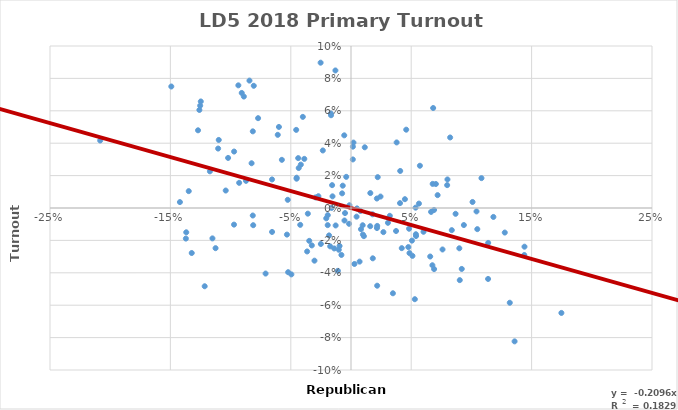
| Category | Series 0 |
|---|---|
| -0.12970652173913044 | 0.101 |
| -0.12705 | 0.048 |
| -0.08158478260869566 | -0.005 |
| 0.0015097560975609729 | 0.03 |
| -0.14924827586206896 | 0.075 |
| -0.059871739130434774 | 0.05 |
| -0.08256739130434783 | 0.028 |
| -0.09356086956521743 | 0.076 |
| -0.12114130434782612 | 0.101 |
| -0.20831428571428576 | 0.042 |
| -0.0928782608695652 | 0.016 |
| -0.08155000000000001 | 0.047 |
| -0.11718043478260871 | 0.023 |
| -0.0843260869565217 | 0.079 |
| -0.06082391304347827 | 0.045 |
| -0.1347695652173913 | 0.01 |
| -0.1421 | 0.004 |
| -0.12593478260869562 | 0.061 |
| -0.0709326086956522 | -0.04 |
| -0.10404782608695652 | 0.011 |
| -0.016760869565217388 | 0.058 |
| -0.1252717391304348 | 0.063 |
| -0.12475434782608695 | 0.066 |
| -0.030333333333333334 | -0.033 |
| 0.004986956521739129 | 0 |
| -0.0871978260869565 | 0.017 |
| -0.11508478260869567 | -0.019 |
| -0.1322826086956522 | -0.028 |
| -0.11035 | 0.037 |
| -0.029365517241379317 | 0.007 |
| -0.016131707317073172 | 0 |
| -0.045165217391304344 | 0.018 |
| 0.007830434782608696 | -0.002 |
| -0.09709130434782606 | 0.035 |
| -0.013939130434782608 | -0.025 |
| -0.018219565217391313 | -0.017 |
| -0.06556410256410256 | -0.015 |
| -0.1371521739130435 | -0.019 |
| -0.006854545454545457 | 0.014 |
| -0.11248965517241381 | -0.025 |
| -0.10984565217391308 | 0.042 |
| 0.04071521739130435 | 0.003 |
| -0.04551739130434782 | 0.048 |
| -0.1368423076923077 | -0.015 |
| -0.08075217391304347 | 0.075 |
| -0.058781818181818185 | -0.123 |
| -0.009490243902439025 | -0.023 |
| -0.015686956521739126 | 0.014 |
| -0.01728043478260869 | -0.024 |
| -0.0971641025641026 | -0.01 |
| -0.035843589743589734 | -0.004 |
| -0.041677272727272736 | 0.027 |
| -0.08122820512820514 | -0.011 |
| 0.04478260869565218 | 0.005 |
| 0.021571739130434787 | -0.012 |
| 0.06651086956521741 | -0.002 |
| -0.020552173913043478 | -0.006 |
| 0.002043478260869566 | 0.04 |
| -0.03877826086956522 | 0.03 |
| -0.02708461538461539 | 0.007 |
| -0.025034782608695662 | -0.022 |
| -0.01273913043478261 | -0.011 |
| 0.04216551724137932 | -0.025 |
| -0.09074782608695654 | 0.071 |
| -0.1215152173913044 | -0.048 |
| -0.005606521739130434 | 0.045 |
| -0.05220869565217392 | -0.04 |
| -0.03468076923076923 | -0.02 |
| -0.04216521739130434 | -0.01 |
| -0.03643846153846155 | -0.027 |
| 0.024519565217391293 | 0.007 |
| 0.017863043478260867 | -0.004 |
| -0.012941304347826086 | 0.085 |
| -0.023421739130434775 | 0.036 |
| 0.021484782608695657 | 0.006 |
| 0.01596585365853659 | -0.011 |
| 0.05104318181818182 | -0.03 |
| -0.04952682926829269 | -0.041 |
| 0.03742391304347826 | -0.014 |
| -0.007965217391304345 | -0.029 |
| -0.04343478260869564 | 0.025 |
| -0.1020717391304348 | 0.031 |
| 0.1009521739130435 | 0.004 |
| 0.06823695652173913 | 0.062 |
| 0.048234615384615376 | -0.013 |
| 0.0028512820512820503 | -0.035 |
| -0.05253478260869566 | 0.005 |
| 0.05302173913043479 | -0.056 |
| -0.004960869565217391 | -0.003 |
| 0.07602173913043477 | -0.026 |
| 0.0097 | -0.011 |
| -0.005421739130434782 | -0.008 |
| 0.04759782608695653 | -0.024 |
| 0.05388695652173913 | -0.016 |
| 0.018104347826086952 | -0.031 |
| -0.0193 | -0.004 |
| 0.08371590909090909 | -0.014 |
| 0.004639130434782611 | -0.005 |
| -0.07716521739130436 | 0.055 |
| 0.03068478260869565 | -0.009 |
| 0.03480681818181818 | -0.053 |
| 0.05064130434782609 | -0.02 |
| 0.010715384615384614 | -0.017 |
| 0.04586086956521737 | 0.048 |
| 0.06783863636363635 | 0.015 |
| 0.03791136363636364 | 0.04 |
| 0.022197560975609758 | 0.019 |
| -0.03254545454545455 | -0.023 |
| 0.057230434782608704 | 0.026 |
| -0.01088695652173913 | -0.039 |
| -0.05741956521739132 | 0.03 |
| 0.0689794871794872 | -0.001 |
| -0.007378260869565226 | 0.009 |
| 0.07047826086956523 | 0.015 |
| 0.07986956521739129 | 0.014 |
| -0.08900434782608693 | 0.069 |
| 0.05643409090909091 | 0.003 |
| -0.043865217391304355 | 0.031 |
| -0.04000434782608695 | 0.056 |
| 0.09198636363636364 | -0.038 |
| 0.01605 | 0.009 |
| 0.007124999999999998 | -0.033 |
| 0.06759318181818183 | -0.035 |
| -0.015356818181818183 | 0.007 |
| 0.10836521739130436 | 0.018 |
| 0.13588043478260872 | -0.082 |
| -0.025226923076923077 | 0.09 |
| 0.048577272727272726 | -0.028 |
| 0.06902173913043479 | -0.038 |
| -0.053196000000000014 | -0.016 |
| 0.04087608695652173 | 0.023 |
| 0.0015769230769230773 | 0.038 |
| -0.019347826086956524 | -0.011 |
| 0.021773170731707318 | -0.011 |
| -0.003960869565217392 | 0.019 |
| 0.09374782608695653 | -0.011 |
| -0.010151282051282053 | -0.026 |
| 0.00828913043478261 | -0.013 |
| 0.07194565217391302 | 0.008 |
| 0.08686521739130434 | -0.004 |
| 0.009899999999999999 | -0.016 |
| -0.016571739130434783 | 0.057 |
| 0.10424772727272723 | -0.002 |
| 0.11393409090909092 | -0.022 |
| 0.08234782608695651 | 0.044 |
| -0.04514146341463413 | 0.019 |
| 0.05399999999999999 | -0.017 |
| 0.011441304347826085 | 0.037 |
| 0.12771956521739128 | -0.015 |
| 0.021749999999999995 | -0.048 |
| 0.06022391304347827 | -0.015 |
| 0.03223478260869565 | -0.005 |
| -0.06558260869565219 | 0.018 |
| 0.08011521739130435 | 0.018 |
| 0.11826521739130434 | -0.006 |
| 0.0903391304347826 | -0.045 |
| -0.0012999999999999976 | 0.002 |
| 0.11385681818181816 | -0.044 |
| 0.05366086956521739 | 0 |
| 0.02690731707317073 | -0.015 |
| -0.0016179487179487167 | -0.01 |
| 0.14391590909090912 | -0.029 |
| 0.14409318181818184 | -0.024 |
| 0.06579347826086958 | -0.03 |
| 0.08996739130434782 | -0.025 |
| 0.10490217391304348 | -0.013 |
| 0.17474545454545456 | -0.065 |
| 0.13187560975609752 | -0.058 |